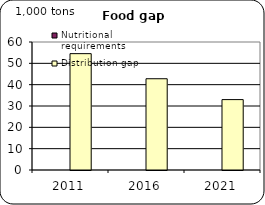
| Category | Nutritional requirements | Distribution gap |
|---|---|---|
| 2011.0 | 0 | 54.541 |
| 2016.0 | 0 | 42.775 |
| 2021.0 | 0 | 32.996 |